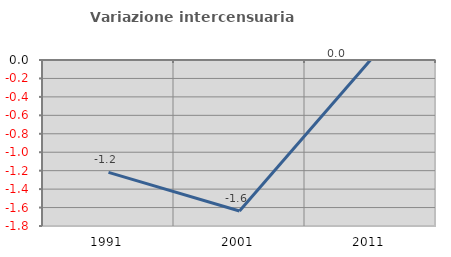
| Category | Variazione intercensuaria annua |
|---|---|
| 1991.0 | -1.219 |
| 2001.0 | -1.637 |
| 2011.0 | 0 |